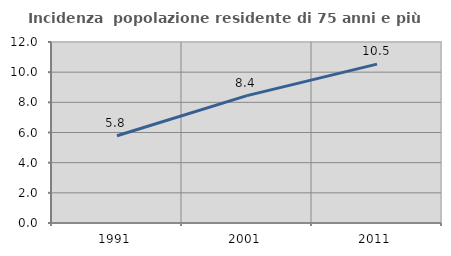
| Category | Incidenza  popolazione residente di 75 anni e più |
|---|---|
| 1991.0 | 5.786 |
| 2001.0 | 8.447 |
| 2011.0 | 10.536 |